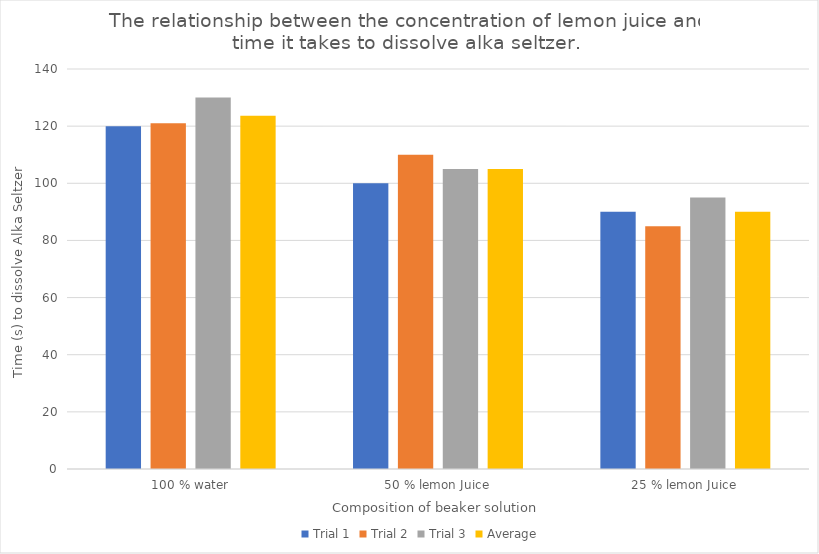
| Category | Trial 1 | Trial 2 | Trial 3 | Average |
|---|---|---|---|---|
| 100 % water | 120 | 121 | 130 | 123.667 |
| 50 % lemon Juice | 100 | 110 | 105 | 105 |
| 25 % lemon Juice | 90 | 85 | 95 | 90 |